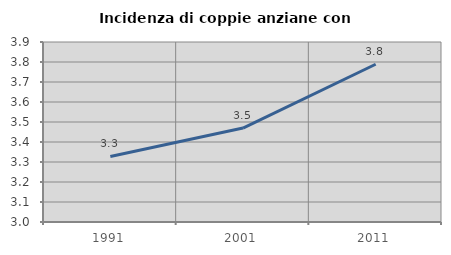
| Category | Incidenza di coppie anziane con figli |
|---|---|
| 1991.0 | 3.328 |
| 2001.0 | 3.47 |
| 2011.0 | 3.789 |